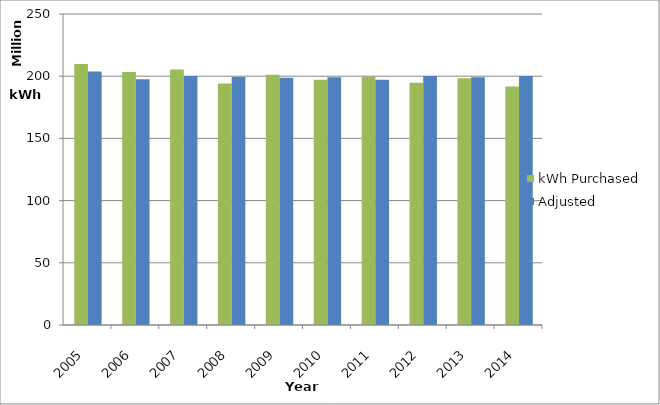
| Category | kWh Purchased | Adjusted |
|---|---|---|
| 2005.0 | 209871328.751 | 203844303.075 |
| 2006.0 | 203367791.46 | 197556431.566 |
| 2007.0 | 205302856.46 | 200186936.866 |
| 2008.0 | 194146899.859 | 199277158.671 |
| 2009.0 | 201115656.46 | 198683586.065 |
| 2010.0 | 197081317.463 | 199197021.014 |
| 2011.0 | 199623009.438 | 197051606.591 |
| 2012.0 | 194771161.25 | 200061553.777 |
| 2013.0 | 198259056.015 | 199210663.166 |
| 2014.0 | 191637148.36 | 200106964.724 |